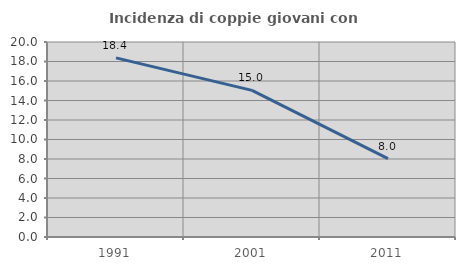
| Category | Incidenza di coppie giovani con figli |
|---|---|
| 1991.0 | 18.371 |
| 2001.0 | 15.04 |
| 2011.0 | 8.034 |